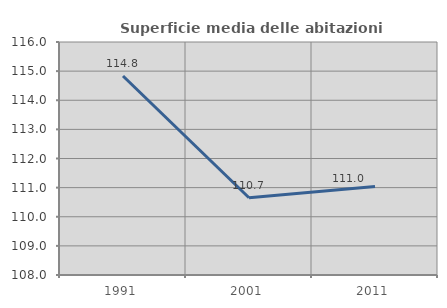
| Category | Superficie media delle abitazioni occupate |
|---|---|
| 1991.0 | 114.833 |
| 2001.0 | 110.653 |
| 2011.0 | 111.04 |